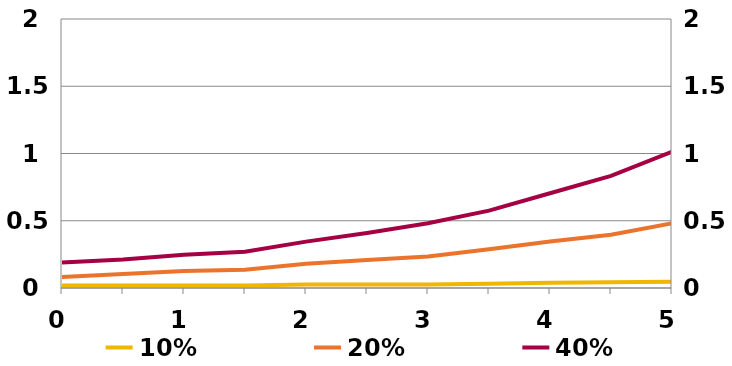
| Category | 10% | 20% |
|---|---|---|
| 0.0 | 0.018 | 0.083 |
| 0.5 | 0.018 | 0.104 |
| 1.0 | 0.018 | 0.126 |
| 1.5 | 0.018 | 0.137 |
| 2.0 | 0.025 | 0.18 |
| 2.5 | 0.025 | 0.208 |
| 3.0 | 0.025 | 0.234 |
| 3.5 | 0.032 | 0.287 |
| 4.0 | 0.04 | 0.345 |
| 4.5 | 0.043 | 0.395 |
| 5.0 | 0.047 | 0.481 |